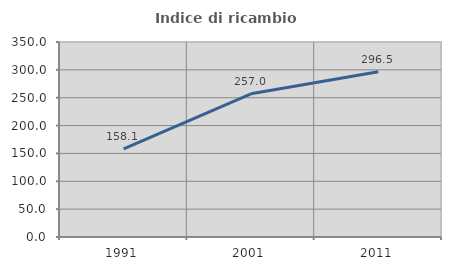
| Category | Indice di ricambio occupazionale  |
|---|---|
| 1991.0 | 158.122 |
| 2001.0 | 256.962 |
| 2011.0 | 296.508 |